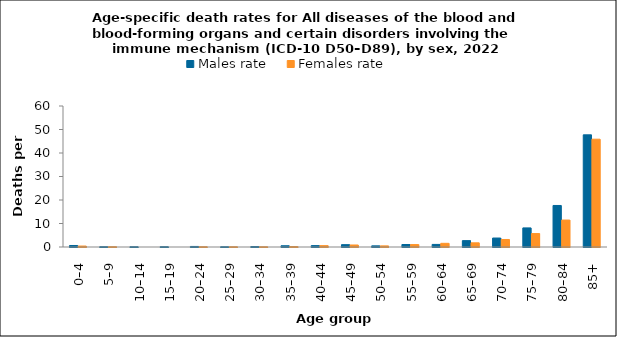
| Category | Males rate | Females rate |
|---|---|---|
| 0–4 | 0.643 | 0.408 |
| 5–9 | 0.121 | 0.128 |
| 10–14 | 0.119 | 0 |
| 15–19 | 0.126 | 0 |
| 20–24 | 0.236 | 0.126 |
| 25–29 | 0.108 | 0.111 |
| 30–34 | 0.211 | 0.103 |
| 35–39 | 0.532 | 0.21 |
| 40–44 | 0.594 | 0.579 |
| 45–49 | 0.996 | 0.854 |
| 50–54 | 0.491 | 0.476 |
| 55–59 | 1.06 | 1.025 |
| 60–64 | 1.103 | 1.565 |
| 65–69 | 2.71 | 1.776 |
| 70–74 | 3.81 | 3.2 |
| 75–79 | 8.121 | 5.725 |
| 80–84 | 17.673 | 11.468 |
| 85+ | 47.725 | 45.872 |